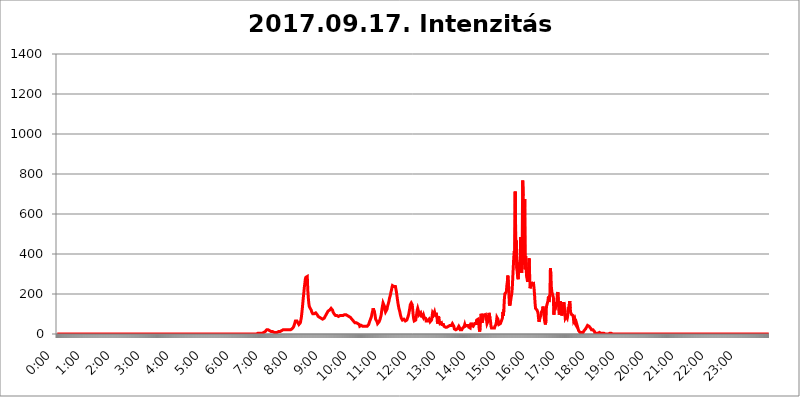
| Category | 2017.09.17. Intenzitás [W/m^2] |
|---|---|
| 0.0 | 0 |
| 0.0006944444444444445 | 0 |
| 0.001388888888888889 | 0 |
| 0.0020833333333333333 | 0 |
| 0.002777777777777778 | 0 |
| 0.003472222222222222 | 0 |
| 0.004166666666666667 | 0 |
| 0.004861111111111111 | 0 |
| 0.005555555555555556 | 0 |
| 0.0062499999999999995 | 0 |
| 0.006944444444444444 | 0 |
| 0.007638888888888889 | 0 |
| 0.008333333333333333 | 0 |
| 0.009027777777777779 | 0 |
| 0.009722222222222222 | 0 |
| 0.010416666666666666 | 0 |
| 0.011111111111111112 | 0 |
| 0.011805555555555555 | 0 |
| 0.012499999999999999 | 0 |
| 0.013194444444444444 | 0 |
| 0.013888888888888888 | 0 |
| 0.014583333333333332 | 0 |
| 0.015277777777777777 | 0 |
| 0.015972222222222224 | 0 |
| 0.016666666666666666 | 0 |
| 0.017361111111111112 | 0 |
| 0.018055555555555557 | 0 |
| 0.01875 | 0 |
| 0.019444444444444445 | 0 |
| 0.02013888888888889 | 0 |
| 0.020833333333333332 | 0 |
| 0.02152777777777778 | 0 |
| 0.022222222222222223 | 0 |
| 0.02291666666666667 | 0 |
| 0.02361111111111111 | 0 |
| 0.024305555555555556 | 0 |
| 0.024999999999999998 | 0 |
| 0.025694444444444447 | 0 |
| 0.02638888888888889 | 0 |
| 0.027083333333333334 | 0 |
| 0.027777777777777776 | 0 |
| 0.02847222222222222 | 0 |
| 0.029166666666666664 | 0 |
| 0.029861111111111113 | 0 |
| 0.030555555555555555 | 0 |
| 0.03125 | 0 |
| 0.03194444444444445 | 0 |
| 0.03263888888888889 | 0 |
| 0.03333333333333333 | 0 |
| 0.034027777777777775 | 0 |
| 0.034722222222222224 | 0 |
| 0.035416666666666666 | 0 |
| 0.036111111111111115 | 0 |
| 0.03680555555555556 | 0 |
| 0.0375 | 0 |
| 0.03819444444444444 | 0 |
| 0.03888888888888889 | 0 |
| 0.03958333333333333 | 0 |
| 0.04027777777777778 | 0 |
| 0.04097222222222222 | 0 |
| 0.041666666666666664 | 0 |
| 0.042361111111111106 | 0 |
| 0.04305555555555556 | 0 |
| 0.043750000000000004 | 0 |
| 0.044444444444444446 | 0 |
| 0.04513888888888889 | 0 |
| 0.04583333333333334 | 0 |
| 0.04652777777777778 | 0 |
| 0.04722222222222222 | 0 |
| 0.04791666666666666 | 0 |
| 0.04861111111111111 | 0 |
| 0.049305555555555554 | 0 |
| 0.049999999999999996 | 0 |
| 0.05069444444444445 | 0 |
| 0.051388888888888894 | 0 |
| 0.052083333333333336 | 0 |
| 0.05277777777777778 | 0 |
| 0.05347222222222222 | 0 |
| 0.05416666666666667 | 0 |
| 0.05486111111111111 | 0 |
| 0.05555555555555555 | 0 |
| 0.05625 | 0 |
| 0.05694444444444444 | 0 |
| 0.057638888888888885 | 0 |
| 0.05833333333333333 | 0 |
| 0.05902777777777778 | 0 |
| 0.059722222222222225 | 0 |
| 0.06041666666666667 | 0 |
| 0.061111111111111116 | 0 |
| 0.06180555555555556 | 0 |
| 0.0625 | 0 |
| 0.06319444444444444 | 0 |
| 0.06388888888888888 | 0 |
| 0.06458333333333334 | 0 |
| 0.06527777777777778 | 0 |
| 0.06597222222222222 | 0 |
| 0.06666666666666667 | 0 |
| 0.06736111111111111 | 0 |
| 0.06805555555555555 | 0 |
| 0.06874999999999999 | 0 |
| 0.06944444444444443 | 0 |
| 0.07013888888888889 | 0 |
| 0.07083333333333333 | 0 |
| 0.07152777777777779 | 0 |
| 0.07222222222222223 | 0 |
| 0.07291666666666667 | 0 |
| 0.07361111111111111 | 0 |
| 0.07430555555555556 | 0 |
| 0.075 | 0 |
| 0.07569444444444444 | 0 |
| 0.0763888888888889 | 0 |
| 0.07708333333333334 | 0 |
| 0.07777777777777778 | 0 |
| 0.07847222222222222 | 0 |
| 0.07916666666666666 | 0 |
| 0.0798611111111111 | 0 |
| 0.08055555555555556 | 0 |
| 0.08125 | 0 |
| 0.08194444444444444 | 0 |
| 0.08263888888888889 | 0 |
| 0.08333333333333333 | 0 |
| 0.08402777777777777 | 0 |
| 0.08472222222222221 | 0 |
| 0.08541666666666665 | 0 |
| 0.08611111111111112 | 0 |
| 0.08680555555555557 | 0 |
| 0.08750000000000001 | 0 |
| 0.08819444444444445 | 0 |
| 0.08888888888888889 | 0 |
| 0.08958333333333333 | 0 |
| 0.09027777777777778 | 0 |
| 0.09097222222222222 | 0 |
| 0.09166666666666667 | 0 |
| 0.09236111111111112 | 0 |
| 0.09305555555555556 | 0 |
| 0.09375 | 0 |
| 0.09444444444444444 | 0 |
| 0.09513888888888888 | 0 |
| 0.09583333333333333 | 0 |
| 0.09652777777777777 | 0 |
| 0.09722222222222222 | 0 |
| 0.09791666666666667 | 0 |
| 0.09861111111111111 | 0 |
| 0.09930555555555555 | 0 |
| 0.09999999999999999 | 0 |
| 0.10069444444444443 | 0 |
| 0.1013888888888889 | 0 |
| 0.10208333333333335 | 0 |
| 0.10277777777777779 | 0 |
| 0.10347222222222223 | 0 |
| 0.10416666666666667 | 0 |
| 0.10486111111111111 | 0 |
| 0.10555555555555556 | 0 |
| 0.10625 | 0 |
| 0.10694444444444444 | 0 |
| 0.1076388888888889 | 0 |
| 0.10833333333333334 | 0 |
| 0.10902777777777778 | 0 |
| 0.10972222222222222 | 0 |
| 0.1111111111111111 | 0 |
| 0.11180555555555556 | 0 |
| 0.11180555555555556 | 0 |
| 0.1125 | 0 |
| 0.11319444444444444 | 0 |
| 0.11388888888888889 | 0 |
| 0.11458333333333333 | 0 |
| 0.11527777777777777 | 0 |
| 0.11597222222222221 | 0 |
| 0.11666666666666665 | 0 |
| 0.1173611111111111 | 0 |
| 0.11805555555555557 | 0 |
| 0.11944444444444445 | 0 |
| 0.12013888888888889 | 0 |
| 0.12083333333333333 | 0 |
| 0.12152777777777778 | 0 |
| 0.12222222222222223 | 0 |
| 0.12291666666666667 | 0 |
| 0.12291666666666667 | 0 |
| 0.12361111111111112 | 0 |
| 0.12430555555555556 | 0 |
| 0.125 | 0 |
| 0.12569444444444444 | 0 |
| 0.12638888888888888 | 0 |
| 0.12708333333333333 | 0 |
| 0.16875 | 0 |
| 0.12847222222222224 | 0 |
| 0.12916666666666668 | 0 |
| 0.12986111111111112 | 0 |
| 0.13055555555555556 | 0 |
| 0.13125 | 0 |
| 0.13194444444444445 | 0 |
| 0.1326388888888889 | 0 |
| 0.13333333333333333 | 0 |
| 0.13402777777777777 | 0 |
| 0.13402777777777777 | 0 |
| 0.13472222222222222 | 0 |
| 0.13541666666666666 | 0 |
| 0.1361111111111111 | 0 |
| 0.13749999999999998 | 0 |
| 0.13819444444444443 | 0 |
| 0.1388888888888889 | 0 |
| 0.13958333333333334 | 0 |
| 0.14027777777777778 | 0 |
| 0.14097222222222222 | 0 |
| 0.14166666666666666 | 0 |
| 0.1423611111111111 | 0 |
| 0.14305555555555557 | 0 |
| 0.14375000000000002 | 0 |
| 0.14444444444444446 | 0 |
| 0.1451388888888889 | 0 |
| 0.1451388888888889 | 0 |
| 0.14652777777777778 | 0 |
| 0.14722222222222223 | 0 |
| 0.14791666666666667 | 0 |
| 0.1486111111111111 | 0 |
| 0.14930555555555555 | 0 |
| 0.15 | 0 |
| 0.15069444444444444 | 0 |
| 0.15138888888888888 | 0 |
| 0.15208333333333332 | 0 |
| 0.15277777777777776 | 0 |
| 0.15347222222222223 | 0 |
| 0.15416666666666667 | 0 |
| 0.15486111111111112 | 0 |
| 0.15555555555555556 | 0 |
| 0.15625 | 0 |
| 0.15694444444444444 | 0 |
| 0.15763888888888888 | 0 |
| 0.15833333333333333 | 0 |
| 0.15902777777777777 | 0 |
| 0.15972222222222224 | 0 |
| 0.16041666666666668 | 0 |
| 0.16111111111111112 | 0 |
| 0.16180555555555556 | 0 |
| 0.1625 | 0 |
| 0.16319444444444445 | 0 |
| 0.1638888888888889 | 0 |
| 0.16458333333333333 | 0 |
| 0.16527777777777777 | 0 |
| 0.16597222222222222 | 0 |
| 0.16666666666666666 | 0 |
| 0.1673611111111111 | 0 |
| 0.16805555555555554 | 0 |
| 0.16874999999999998 | 0 |
| 0.16944444444444443 | 0 |
| 0.17013888888888887 | 0 |
| 0.1708333333333333 | 0 |
| 0.17152777777777775 | 0 |
| 0.17222222222222225 | 0 |
| 0.1729166666666667 | 0 |
| 0.17361111111111113 | 0 |
| 0.17430555555555557 | 0 |
| 0.17500000000000002 | 0 |
| 0.17569444444444446 | 0 |
| 0.1763888888888889 | 0 |
| 0.17708333333333334 | 0 |
| 0.17777777777777778 | 0 |
| 0.17847222222222223 | 0 |
| 0.17916666666666667 | 0 |
| 0.1798611111111111 | 0 |
| 0.18055555555555555 | 0 |
| 0.18125 | 0 |
| 0.18194444444444444 | 0 |
| 0.1826388888888889 | 0 |
| 0.18333333333333335 | 0 |
| 0.1840277777777778 | 0 |
| 0.18472222222222223 | 0 |
| 0.18541666666666667 | 0 |
| 0.18611111111111112 | 0 |
| 0.18680555555555556 | 0 |
| 0.1875 | 0 |
| 0.18819444444444444 | 0 |
| 0.18888888888888888 | 0 |
| 0.18958333333333333 | 0 |
| 0.19027777777777777 | 0 |
| 0.1909722222222222 | 0 |
| 0.19166666666666665 | 0 |
| 0.19236111111111112 | 0 |
| 0.19305555555555554 | 0 |
| 0.19375 | 0 |
| 0.19444444444444445 | 0 |
| 0.1951388888888889 | 0 |
| 0.19583333333333333 | 0 |
| 0.19652777777777777 | 0 |
| 0.19722222222222222 | 0 |
| 0.19791666666666666 | 0 |
| 0.1986111111111111 | 0 |
| 0.19930555555555554 | 0 |
| 0.19999999999999998 | 0 |
| 0.20069444444444443 | 0 |
| 0.20138888888888887 | 0 |
| 0.2020833333333333 | 0 |
| 0.2027777777777778 | 0 |
| 0.2034722222222222 | 0 |
| 0.2041666666666667 | 0 |
| 0.20486111111111113 | 0 |
| 0.20555555555555557 | 0 |
| 0.20625000000000002 | 0 |
| 0.20694444444444446 | 0 |
| 0.2076388888888889 | 0 |
| 0.20833333333333334 | 0 |
| 0.20902777777777778 | 0 |
| 0.20972222222222223 | 0 |
| 0.21041666666666667 | 0 |
| 0.2111111111111111 | 0 |
| 0.21180555555555555 | 0 |
| 0.2125 | 0 |
| 0.21319444444444444 | 0 |
| 0.2138888888888889 | 0 |
| 0.21458333333333335 | 0 |
| 0.2152777777777778 | 0 |
| 0.21597222222222223 | 0 |
| 0.21666666666666667 | 0 |
| 0.21736111111111112 | 0 |
| 0.21805555555555556 | 0 |
| 0.21875 | 0 |
| 0.21944444444444444 | 0 |
| 0.22013888888888888 | 0 |
| 0.22083333333333333 | 0 |
| 0.22152777777777777 | 0 |
| 0.2222222222222222 | 0 |
| 0.22291666666666665 | 0 |
| 0.2236111111111111 | 0 |
| 0.22430555555555556 | 0 |
| 0.225 | 0 |
| 0.22569444444444445 | 0 |
| 0.2263888888888889 | 0 |
| 0.22708333333333333 | 0 |
| 0.22777777777777777 | 0 |
| 0.22847222222222222 | 0 |
| 0.22916666666666666 | 0 |
| 0.2298611111111111 | 0 |
| 0.23055555555555554 | 0 |
| 0.23124999999999998 | 0 |
| 0.23194444444444443 | 0 |
| 0.23263888888888887 | 0 |
| 0.2333333333333333 | 0 |
| 0.2340277777777778 | 0 |
| 0.2347222222222222 | 0 |
| 0.2354166666666667 | 0 |
| 0.23611111111111113 | 0 |
| 0.23680555555555557 | 0 |
| 0.23750000000000002 | 0 |
| 0.23819444444444446 | 0 |
| 0.2388888888888889 | 0 |
| 0.23958333333333334 | 0 |
| 0.24027777777777778 | 0 |
| 0.24097222222222223 | 0 |
| 0.24166666666666667 | 0 |
| 0.2423611111111111 | 0 |
| 0.24305555555555555 | 0 |
| 0.24375 | 0 |
| 0.24444444444444446 | 0 |
| 0.24513888888888888 | 0 |
| 0.24583333333333335 | 0 |
| 0.2465277777777778 | 0 |
| 0.24722222222222223 | 0 |
| 0.24791666666666667 | 0 |
| 0.24861111111111112 | 0 |
| 0.24930555555555556 | 0 |
| 0.25 | 0 |
| 0.25069444444444444 | 0 |
| 0.2513888888888889 | 0 |
| 0.2520833333333333 | 0 |
| 0.25277777777777777 | 0 |
| 0.2534722222222222 | 0 |
| 0.25416666666666665 | 0 |
| 0.2548611111111111 | 0 |
| 0.2555555555555556 | 0 |
| 0.25625000000000003 | 0 |
| 0.2569444444444445 | 0 |
| 0.2576388888888889 | 0 |
| 0.25833333333333336 | 0 |
| 0.2590277777777778 | 0 |
| 0.25972222222222224 | 0 |
| 0.2604166666666667 | 0 |
| 0.2611111111111111 | 0 |
| 0.26180555555555557 | 0 |
| 0.2625 | 0 |
| 0.26319444444444445 | 0 |
| 0.2638888888888889 | 0 |
| 0.26458333333333334 | 0 |
| 0.2652777777777778 | 0 |
| 0.2659722222222222 | 0 |
| 0.26666666666666666 | 0 |
| 0.2673611111111111 | 0 |
| 0.26805555555555555 | 0 |
| 0.26875 | 0 |
| 0.26944444444444443 | 0 |
| 0.2701388888888889 | 0 |
| 0.2708333333333333 | 0 |
| 0.27152777777777776 | 0 |
| 0.2722222222222222 | 0 |
| 0.27291666666666664 | 0 |
| 0.2736111111111111 | 0 |
| 0.2743055555555555 | 0 |
| 0.27499999999999997 | 0 |
| 0.27569444444444446 | 0 |
| 0.27638888888888885 | 0 |
| 0.27708333333333335 | 0 |
| 0.2777777777777778 | 0 |
| 0.27847222222222223 | 0 |
| 0.2791666666666667 | 0 |
| 0.2798611111111111 | 0 |
| 0.28055555555555556 | 3.525 |
| 0.28125 | 3.525 |
| 0.28194444444444444 | 3.525 |
| 0.2826388888888889 | 3.525 |
| 0.2833333333333333 | 3.525 |
| 0.28402777777777777 | 3.525 |
| 0.2847222222222222 | 3.525 |
| 0.28541666666666665 | 3.525 |
| 0.28611111111111115 | 3.525 |
| 0.28680555555555554 | 3.525 |
| 0.28750000000000003 | 3.525 |
| 0.2881944444444445 | 3.525 |
| 0.2888888888888889 | 7.887 |
| 0.28958333333333336 | 7.887 |
| 0.2902777777777778 | 7.887 |
| 0.29097222222222224 | 7.887 |
| 0.2916666666666667 | 12.257 |
| 0.2923611111111111 | 16.636 |
| 0.29305555555555557 | 16.636 |
| 0.29375 | 21.024 |
| 0.29444444444444445 | 21.024 |
| 0.2951388888888889 | 21.024 |
| 0.29583333333333334 | 21.024 |
| 0.2965277777777778 | 16.636 |
| 0.2972222222222222 | 16.636 |
| 0.29791666666666666 | 16.636 |
| 0.2986111111111111 | 16.636 |
| 0.29930555555555555 | 16.636 |
| 0.3 | 12.257 |
| 0.30069444444444443 | 12.257 |
| 0.3013888888888889 | 12.257 |
| 0.3020833333333333 | 12.257 |
| 0.30277777777777776 | 12.257 |
| 0.3034722222222222 | 12.257 |
| 0.30416666666666664 | 7.887 |
| 0.3048611111111111 | 7.887 |
| 0.3055555555555555 | 7.887 |
| 0.30624999999999997 | 7.887 |
| 0.3069444444444444 | 7.887 |
| 0.3076388888888889 | 7.887 |
| 0.30833333333333335 | 7.887 |
| 0.3090277777777778 | 12.257 |
| 0.30972222222222223 | 12.257 |
| 0.3104166666666667 | 12.257 |
| 0.3111111111111111 | 12.257 |
| 0.31180555555555556 | 12.257 |
| 0.3125 | 12.257 |
| 0.31319444444444444 | 12.257 |
| 0.3138888888888889 | 12.257 |
| 0.3145833333333333 | 16.636 |
| 0.31527777777777777 | 16.636 |
| 0.3159722222222222 | 16.636 |
| 0.31666666666666665 | 21.024 |
| 0.31736111111111115 | 21.024 |
| 0.31805555555555554 | 21.024 |
| 0.31875000000000003 | 21.024 |
| 0.3194444444444445 | 21.024 |
| 0.3201388888888889 | 21.024 |
| 0.32083333333333336 | 21.024 |
| 0.3215277777777778 | 16.636 |
| 0.32222222222222224 | 16.636 |
| 0.3229166666666667 | 21.024 |
| 0.3236111111111111 | 21.024 |
| 0.32430555555555557 | 21.024 |
| 0.325 | 21.024 |
| 0.32569444444444445 | 21.024 |
| 0.3263888888888889 | 21.024 |
| 0.32708333333333334 | 21.024 |
| 0.3277777777777778 | 25.419 |
| 0.3284722222222222 | 25.419 |
| 0.32916666666666666 | 25.419 |
| 0.3298611111111111 | 25.419 |
| 0.33055555555555555 | 29.823 |
| 0.33125 | 34.234 |
| 0.33194444444444443 | 38.653 |
| 0.3326388888888889 | 47.511 |
| 0.3333333333333333 | 56.398 |
| 0.3340277777777778 | 65.31 |
| 0.3347222222222222 | 69.775 |
| 0.3354166666666667 | 69.775 |
| 0.3361111111111111 | 65.31 |
| 0.3368055555555556 | 60.85 |
| 0.33749999999999997 | 56.398 |
| 0.33819444444444446 | 51.951 |
| 0.33888888888888885 | 47.511 |
| 0.33958333333333335 | 47.511 |
| 0.34027777777777773 | 51.951 |
| 0.34097222222222223 | 56.398 |
| 0.3416666666666666 | 69.775 |
| 0.3423611111111111 | 83.205 |
| 0.3430555555555555 | 105.69 |
| 0.34375 | 128.284 |
| 0.3444444444444445 | 155.509 |
| 0.3451388888888889 | 182.82 |
| 0.3458333333333334 | 205.62 |
| 0.34652777777777777 | 233 |
| 0.34722222222222227 | 251.251 |
| 0.34791666666666665 | 274.047 |
| 0.34861111111111115 | 283.156 |
| 0.34930555555555554 | 287.709 |
| 0.35000000000000003 | 278.603 |
| 0.3506944444444444 | 287.709 |
| 0.3513888888888889 | 219.309 |
| 0.3520833333333333 | 182.82 |
| 0.3527777777777778 | 155.509 |
| 0.3534722222222222 | 137.347 |
| 0.3541666666666667 | 132.814 |
| 0.3548611111111111 | 128.284 |
| 0.35555555555555557 | 123.758 |
| 0.35625 | 119.235 |
| 0.35694444444444445 | 110.201 |
| 0.3576388888888889 | 105.69 |
| 0.35833333333333334 | 101.184 |
| 0.3590277777777778 | 101.184 |
| 0.3597222222222222 | 101.184 |
| 0.36041666666666666 | 101.184 |
| 0.3611111111111111 | 105.69 |
| 0.36180555555555555 | 105.69 |
| 0.3625 | 105.69 |
| 0.36319444444444443 | 105.69 |
| 0.3638888888888889 | 101.184 |
| 0.3645833333333333 | 96.682 |
| 0.3652777777777778 | 92.184 |
| 0.3659722222222222 | 87.692 |
| 0.3666666666666667 | 83.205 |
| 0.3673611111111111 | 83.205 |
| 0.3680555555555556 | 83.205 |
| 0.36874999999999997 | 83.205 |
| 0.36944444444444446 | 78.722 |
| 0.37013888888888885 | 78.722 |
| 0.37083333333333335 | 74.246 |
| 0.37152777777777773 | 74.246 |
| 0.37222222222222223 | 74.246 |
| 0.3729166666666666 | 74.246 |
| 0.3736111111111111 | 74.246 |
| 0.3743055555555555 | 78.722 |
| 0.375 | 83.205 |
| 0.3756944444444445 | 87.692 |
| 0.3763888888888889 | 92.184 |
| 0.3770833333333334 | 96.682 |
| 0.37777777777777777 | 101.184 |
| 0.37847222222222227 | 105.69 |
| 0.37916666666666665 | 110.201 |
| 0.37986111111111115 | 114.716 |
| 0.38055555555555554 | 114.716 |
| 0.38125000000000003 | 119.235 |
| 0.3819444444444444 | 119.235 |
| 0.3826388888888889 | 123.758 |
| 0.3833333333333333 | 123.758 |
| 0.3840277777777778 | 128.284 |
| 0.3847222222222222 | 128.284 |
| 0.3854166666666667 | 123.758 |
| 0.3861111111111111 | 119.235 |
| 0.38680555555555557 | 110.201 |
| 0.3875 | 105.69 |
| 0.38819444444444445 | 101.184 |
| 0.3888888888888889 | 101.184 |
| 0.38958333333333334 | 96.682 |
| 0.3902777777777778 | 92.184 |
| 0.3909722222222222 | 92.184 |
| 0.39166666666666666 | 92.184 |
| 0.3923611111111111 | 92.184 |
| 0.39305555555555555 | 87.692 |
| 0.39375 | 87.692 |
| 0.39444444444444443 | 87.692 |
| 0.3951388888888889 | 87.692 |
| 0.3958333333333333 | 92.184 |
| 0.3965277777777778 | 92.184 |
| 0.3972222222222222 | 92.184 |
| 0.3979166666666667 | 92.184 |
| 0.3986111111111111 | 92.184 |
| 0.3993055555555556 | 92.184 |
| 0.39999999999999997 | 92.184 |
| 0.40069444444444446 | 92.184 |
| 0.40138888888888885 | 92.184 |
| 0.40208333333333335 | 92.184 |
| 0.40277777777777773 | 96.682 |
| 0.40347222222222223 | 96.682 |
| 0.4041666666666666 | 96.682 |
| 0.4048611111111111 | 96.682 |
| 0.4055555555555555 | 92.184 |
| 0.40625 | 92.184 |
| 0.4069444444444445 | 92.184 |
| 0.4076388888888889 | 87.692 |
| 0.4083333333333334 | 87.692 |
| 0.40902777777777777 | 87.692 |
| 0.40972222222222227 | 83.205 |
| 0.41041666666666665 | 83.205 |
| 0.41111111111111115 | 83.205 |
| 0.41180555555555554 | 78.722 |
| 0.41250000000000003 | 78.722 |
| 0.4131944444444444 | 74.246 |
| 0.4138888888888889 | 74.246 |
| 0.4145833333333333 | 69.775 |
| 0.4152777777777778 | 65.31 |
| 0.4159722222222222 | 60.85 |
| 0.4166666666666667 | 60.85 |
| 0.4173611111111111 | 56.398 |
| 0.41805555555555557 | 56.398 |
| 0.41875 | 56.398 |
| 0.41944444444444445 | 56.398 |
| 0.4201388888888889 | 56.398 |
| 0.42083333333333334 | 56.398 |
| 0.4215277777777778 | 51.951 |
| 0.4222222222222222 | 51.951 |
| 0.42291666666666666 | 47.511 |
| 0.4236111111111111 | 47.511 |
| 0.42430555555555555 | 38.653 |
| 0.425 | 38.653 |
| 0.42569444444444443 | 38.653 |
| 0.4263888888888889 | 43.079 |
| 0.4270833333333333 | 43.079 |
| 0.4277777777777778 | 43.079 |
| 0.4284722222222222 | 38.653 |
| 0.4291666666666667 | 38.653 |
| 0.4298611111111111 | 38.653 |
| 0.4305555555555556 | 38.653 |
| 0.43124999999999997 | 38.653 |
| 0.43194444444444446 | 38.653 |
| 0.43263888888888885 | 38.653 |
| 0.43333333333333335 | 38.653 |
| 0.43402777777777773 | 38.653 |
| 0.43472222222222223 | 38.653 |
| 0.4354166666666666 | 38.653 |
| 0.4361111111111111 | 43.079 |
| 0.4368055555555555 | 47.511 |
| 0.4375 | 56.398 |
| 0.4381944444444445 | 60.85 |
| 0.4388888888888889 | 69.775 |
| 0.4395833333333334 | 74.246 |
| 0.44027777777777777 | 83.205 |
| 0.44097222222222227 | 92.184 |
| 0.44166666666666665 | 105.69 |
| 0.44236111111111115 | 114.716 |
| 0.44305555555555554 | 128.284 |
| 0.44375000000000003 | 128.284 |
| 0.4444444444444444 | 123.758 |
| 0.4451388888888889 | 105.69 |
| 0.4458333333333333 | 92.184 |
| 0.4465277777777778 | 74.246 |
| 0.4472222222222222 | 69.775 |
| 0.4479166666666667 | 69.775 |
| 0.4486111111111111 | 60.85 |
| 0.44930555555555557 | 51.951 |
| 0.45 | 51.951 |
| 0.45069444444444445 | 56.398 |
| 0.4513888888888889 | 60.85 |
| 0.45208333333333334 | 65.31 |
| 0.4527777777777778 | 74.246 |
| 0.4534722222222222 | 78.722 |
| 0.45416666666666666 | 92.184 |
| 0.4548611111111111 | 110.201 |
| 0.45555555555555555 | 128.284 |
| 0.45625 | 141.884 |
| 0.45694444444444443 | 155.509 |
| 0.4576388888888889 | 160.056 |
| 0.4583333333333333 | 155.509 |
| 0.4590277777777778 | 137.347 |
| 0.4597222222222222 | 119.235 |
| 0.4604166666666667 | 110.201 |
| 0.4611111111111111 | 110.201 |
| 0.4618055555555556 | 110.201 |
| 0.46249999999999997 | 123.758 |
| 0.46319444444444446 | 137.347 |
| 0.46388888888888885 | 146.423 |
| 0.46458333333333335 | 155.509 |
| 0.46527777777777773 | 164.605 |
| 0.46597222222222223 | 178.264 |
| 0.4666666666666666 | 187.378 |
| 0.4673611111111111 | 196.497 |
| 0.4680555555555555 | 210.182 |
| 0.46875 | 219.309 |
| 0.4694444444444445 | 233 |
| 0.4701388888888889 | 242.127 |
| 0.4708333333333334 | 246.689 |
| 0.47152777777777777 | 237.564 |
| 0.47222222222222227 | 237.564 |
| 0.47291666666666665 | 237.564 |
| 0.47361111111111115 | 242.127 |
| 0.47430555555555554 | 237.564 |
| 0.47500000000000003 | 233 |
| 0.4756944444444444 | 210.182 |
| 0.4763888888888889 | 191.937 |
| 0.4770833333333333 | 173.709 |
| 0.4777777777777778 | 155.509 |
| 0.4784722222222222 | 141.884 |
| 0.4791666666666667 | 128.284 |
| 0.4798611111111111 | 119.235 |
| 0.48055555555555557 | 110.201 |
| 0.48125 | 96.682 |
| 0.48194444444444445 | 87.692 |
| 0.4826388888888889 | 78.722 |
| 0.48333333333333334 | 74.246 |
| 0.4840277777777778 | 69.775 |
| 0.4847222222222222 | 74.246 |
| 0.48541666666666666 | 74.246 |
| 0.4861111111111111 | 74.246 |
| 0.48680555555555555 | 78.722 |
| 0.4875 | 74.246 |
| 0.48819444444444443 | 65.31 |
| 0.4888888888888889 | 65.31 |
| 0.4895833333333333 | 65.31 |
| 0.4902777777777778 | 69.775 |
| 0.4909722222222222 | 74.246 |
| 0.4916666666666667 | 83.205 |
| 0.4923611111111111 | 92.184 |
| 0.4930555555555556 | 101.184 |
| 0.49374999999999997 | 114.716 |
| 0.49444444444444446 | 128.284 |
| 0.49513888888888885 | 146.423 |
| 0.49583333333333335 | 150.964 |
| 0.49652777777777773 | 155.509 |
| 0.49722222222222223 | 160.056 |
| 0.4979166666666666 | 146.423 |
| 0.4986111111111111 | 119.235 |
| 0.4993055555555555 | 92.184 |
| 0.5 | 74.246 |
| 0.5006944444444444 | 65.31 |
| 0.5013888888888889 | 65.31 |
| 0.5020833333333333 | 65.31 |
| 0.5027777777777778 | 69.775 |
| 0.5034722222222222 | 83.205 |
| 0.5041666666666667 | 101.184 |
| 0.5048611111111111 | 119.235 |
| 0.5055555555555555 | 128.284 |
| 0.50625 | 123.758 |
| 0.5069444444444444 | 110.201 |
| 0.5076388888888889 | 96.682 |
| 0.5083333333333333 | 92.184 |
| 0.5090277777777777 | 101.184 |
| 0.5097222222222222 | 105.69 |
| 0.5104166666666666 | 101.184 |
| 0.5111111111111112 | 83.205 |
| 0.5118055555555555 | 92.184 |
| 0.5125000000000001 | 87.692 |
| 0.5131944444444444 | 83.205 |
| 0.513888888888889 | 92.184 |
| 0.5145833333333333 | 83.205 |
| 0.5152777777777778 | 78.722 |
| 0.5159722222222222 | 78.722 |
| 0.5166666666666667 | 78.722 |
| 0.517361111111111 | 65.31 |
| 0.5180555555555556 | 60.85 |
| 0.5187499999999999 | 65.31 |
| 0.5194444444444445 | 65.31 |
| 0.5201388888888888 | 65.31 |
| 0.5208333333333334 | 65.31 |
| 0.5215277777777778 | 74.246 |
| 0.5222222222222223 | 69.775 |
| 0.5229166666666667 | 60.85 |
| 0.5236111111111111 | 65.31 |
| 0.5243055555555556 | 60.85 |
| 0.525 | 69.775 |
| 0.5256944444444445 | 87.692 |
| 0.5263888888888889 | 105.69 |
| 0.5270833333333333 | 101.184 |
| 0.5277777777777778 | 96.682 |
| 0.5284722222222222 | 101.184 |
| 0.5291666666666667 | 110.201 |
| 0.5298611111111111 | 105.69 |
| 0.5305555555555556 | 87.692 |
| 0.53125 | 105.69 |
| 0.5319444444444444 | 101.184 |
| 0.5326388888888889 | 83.205 |
| 0.5333333333333333 | 51.951 |
| 0.5340277777777778 | 60.85 |
| 0.5347222222222222 | 87.692 |
| 0.5354166666666667 | 78.722 |
| 0.5361111111111111 | 60.85 |
| 0.5368055555555555 | 51.951 |
| 0.5375 | 56.398 |
| 0.5381944444444444 | 56.398 |
| 0.5388888888888889 | 56.398 |
| 0.5395833333333333 | 47.511 |
| 0.5402777777777777 | 47.511 |
| 0.5409722222222222 | 47.511 |
| 0.5416666666666666 | 47.511 |
| 0.5423611111111112 | 38.653 |
| 0.5430555555555555 | 38.653 |
| 0.5437500000000001 | 38.653 |
| 0.5444444444444444 | 34.234 |
| 0.545138888888889 | 34.234 |
| 0.5458333333333333 | 34.234 |
| 0.5465277777777778 | 34.234 |
| 0.5472222222222222 | 34.234 |
| 0.5479166666666667 | 34.234 |
| 0.548611111111111 | 38.653 |
| 0.5493055555555556 | 38.653 |
| 0.5499999999999999 | 38.653 |
| 0.5506944444444445 | 43.079 |
| 0.5513888888888888 | 47.511 |
| 0.5520833333333334 | 43.079 |
| 0.5527777777777778 | 43.079 |
| 0.5534722222222223 | 47.511 |
| 0.5541666666666667 | 51.951 |
| 0.5548611111111111 | 47.511 |
| 0.5555555555555556 | 47.511 |
| 0.55625 | 38.653 |
| 0.5569444444444445 | 25.419 |
| 0.5576388888888889 | 25.419 |
| 0.5583333333333333 | 25.419 |
| 0.5590277777777778 | 21.024 |
| 0.5597222222222222 | 21.024 |
| 0.5604166666666667 | 21.024 |
| 0.5611111111111111 | 25.419 |
| 0.5618055555555556 | 29.823 |
| 0.5625 | 29.823 |
| 0.5631944444444444 | 38.653 |
| 0.5638888888888889 | 34.234 |
| 0.5645833333333333 | 29.823 |
| 0.5652777777777778 | 21.024 |
| 0.5659722222222222 | 21.024 |
| 0.5666666666666667 | 21.024 |
| 0.5673611111111111 | 21.024 |
| 0.5680555555555555 | 21.024 |
| 0.56875 | 29.823 |
| 0.5694444444444444 | 29.823 |
| 0.5701388888888889 | 29.823 |
| 0.5708333333333333 | 38.653 |
| 0.5715277777777777 | 47.511 |
| 0.5722222222222222 | 38.653 |
| 0.5729166666666666 | 38.653 |
| 0.5736111111111112 | 38.653 |
| 0.5743055555555555 | 43.079 |
| 0.5750000000000001 | 47.511 |
| 0.5756944444444444 | 47.511 |
| 0.576388888888889 | 43.079 |
| 0.5770833333333333 | 34.234 |
| 0.5777777777777778 | 29.823 |
| 0.5784722222222222 | 29.823 |
| 0.5791666666666667 | 29.823 |
| 0.579861111111111 | 47.511 |
| 0.5805555555555556 | 56.398 |
| 0.5812499999999999 | 43.079 |
| 0.5819444444444445 | 38.653 |
| 0.5826388888888888 | 38.653 |
| 0.5833333333333334 | 38.653 |
| 0.5840277777777778 | 38.653 |
| 0.5847222222222223 | 43.079 |
| 0.5854166666666667 | 51.951 |
| 0.5861111111111111 | 56.398 |
| 0.5868055555555556 | 51.951 |
| 0.5875 | 51.951 |
| 0.5881944444444445 | 69.775 |
| 0.5888888888888889 | 69.775 |
| 0.5895833333333333 | 74.246 |
| 0.5902777777777778 | 74.246 |
| 0.5909722222222222 | 60.85 |
| 0.5916666666666667 | 29.823 |
| 0.5923611111111111 | 12.257 |
| 0.5930555555555556 | 29.823 |
| 0.59375 | 69.775 |
| 0.5944444444444444 | 101.184 |
| 0.5951388888888889 | 87.692 |
| 0.5958333333333333 | 56.398 |
| 0.5965277777777778 | 60.85 |
| 0.5972222222222222 | 78.722 |
| 0.5979166666666667 | 101.184 |
| 0.5986111111111111 | 92.184 |
| 0.5993055555555555 | 96.682 |
| 0.6 | 92.184 |
| 0.6006944444444444 | 96.682 |
| 0.6013888888888889 | 96.682 |
| 0.6020833333333333 | 69.775 |
| 0.6027777777777777 | 51.951 |
| 0.6034722222222222 | 47.511 |
| 0.6041666666666666 | 51.951 |
| 0.6048611111111112 | 69.775 |
| 0.6055555555555555 | 105.69 |
| 0.6062500000000001 | 105.69 |
| 0.6069444444444444 | 78.722 |
| 0.607638888888889 | 65.31 |
| 0.6083333333333333 | 38.653 |
| 0.6090277777777778 | 29.823 |
| 0.6097222222222222 | 34.234 |
| 0.6104166666666667 | 34.234 |
| 0.611111111111111 | 29.823 |
| 0.6118055555555556 | 25.419 |
| 0.6124999999999999 | 25.419 |
| 0.6131944444444445 | 29.823 |
| 0.6138888888888888 | 38.653 |
| 0.6145833333333334 | 43.079 |
| 0.6152777777777778 | 47.511 |
| 0.6159722222222223 | 60.85 |
| 0.6166666666666667 | 83.205 |
| 0.6173611111111111 | 78.722 |
| 0.6180555555555556 | 74.246 |
| 0.61875 | 69.775 |
| 0.6194444444444445 | 47.511 |
| 0.6201388888888889 | 43.079 |
| 0.6208333333333333 | 47.511 |
| 0.6215277777777778 | 51.951 |
| 0.6222222222222222 | 56.398 |
| 0.6229166666666667 | 65.31 |
| 0.6236111111111111 | 65.31 |
| 0.6243055555555556 | 78.722 |
| 0.625 | 110.201 |
| 0.6256944444444444 | 92.184 |
| 0.6263888888888889 | 123.758 |
| 0.6270833333333333 | 173.709 |
| 0.6277777777777778 | 201.058 |
| 0.6284722222222222 | 205.62 |
| 0.6291666666666667 | 196.497 |
| 0.6298611111111111 | 210.182 |
| 0.6305555555555555 | 242.127 |
| 0.63125 | 260.373 |
| 0.6319444444444444 | 292.259 |
| 0.6326388888888889 | 287.709 |
| 0.6333333333333333 | 223.873 |
| 0.6340277777777777 | 150.964 |
| 0.6347222222222222 | 141.884 |
| 0.6354166666666666 | 141.884 |
| 0.6361111111111112 | 173.709 |
| 0.6368055555555555 | 187.378 |
| 0.6375000000000001 | 201.058 |
| 0.6381944444444444 | 228.436 |
| 0.638888888888889 | 283.156 |
| 0.6395833333333333 | 283.156 |
| 0.6402777777777778 | 382.715 |
| 0.6409722222222222 | 414.035 |
| 0.6416666666666667 | 396.164 |
| 0.642361111111111 | 711.832 |
| 0.6430555555555556 | 431.833 |
| 0.6437499999999999 | 467.187 |
| 0.6444444444444445 | 328.584 |
| 0.6451388888888888 | 310.44 |
| 0.6458333333333334 | 283.156 |
| 0.6465277777777778 | 274.047 |
| 0.6472222222222223 | 342.162 |
| 0.6479166666666667 | 333.113 |
| 0.6486111111111111 | 360.221 |
| 0.6493055555555556 | 391.685 |
| 0.65 | 484.735 |
| 0.6506944444444445 | 337.639 |
| 0.6513888888888889 | 305.898 |
| 0.6520833333333333 | 436.27 |
| 0.6527777777777778 | 767.62 |
| 0.6534722222222222 | 691.608 |
| 0.6541666666666667 | 695.666 |
| 0.6548611111111111 | 346.682 |
| 0.6555555555555556 | 675.311 |
| 0.65625 | 324.052 |
| 0.6569444444444444 | 387.202 |
| 0.6576388888888889 | 324.052 |
| 0.6583333333333333 | 287.709 |
| 0.6590277777777778 | 283.156 |
| 0.6597222222222222 | 260.373 |
| 0.6604166666666667 | 292.259 |
| 0.6611111111111111 | 287.709 |
| 0.6618055555555555 | 378.224 |
| 0.6625 | 301.354 |
| 0.6631944444444444 | 228.436 |
| 0.6638888888888889 | 237.564 |
| 0.6645833333333333 | 260.373 |
| 0.6652777777777777 | 264.932 |
| 0.6659722222222222 | 246.689 |
| 0.6666666666666666 | 242.127 |
| 0.6673611111111111 | 242.127 |
| 0.6680555555555556 | 251.251 |
| 0.6687500000000001 | 228.436 |
| 0.6694444444444444 | 196.497 |
| 0.6701388888888888 | 155.509 |
| 0.6708333333333334 | 128.284 |
| 0.6715277777777778 | 128.284 |
| 0.6722222222222222 | 123.758 |
| 0.6729166666666666 | 119.235 |
| 0.6736111111111112 | 123.758 |
| 0.6743055555555556 | 105.69 |
| 0.6749999999999999 | 78.722 |
| 0.6756944444444444 | 60.85 |
| 0.6763888888888889 | 60.85 |
| 0.6770833333333334 | 83.205 |
| 0.6777777777777777 | 87.692 |
| 0.6784722222222223 | 92.184 |
| 0.6791666666666667 | 110.201 |
| 0.6798611111111111 | 105.69 |
| 0.6805555555555555 | 119.235 |
| 0.68125 | 137.347 |
| 0.6819444444444445 | 119.235 |
| 0.6826388888888889 | 105.69 |
| 0.6833333333333332 | 69.775 |
| 0.6840277777777778 | 56.398 |
| 0.6847222222222222 | 47.511 |
| 0.6854166666666667 | 69.775 |
| 0.686111111111111 | 137.347 |
| 0.6868055555555556 | 137.347 |
| 0.6875 | 132.814 |
| 0.6881944444444444 | 164.605 |
| 0.688888888888889 | 187.378 |
| 0.6895833333333333 | 160.056 |
| 0.6902777777777778 | 164.605 |
| 0.6909722222222222 | 196.497 |
| 0.6916666666666668 | 328.584 |
| 0.6923611111111111 | 292.259 |
| 0.6930555555555555 | 233 |
| 0.69375 | 210.182 |
| 0.6944444444444445 | 201.058 |
| 0.6951388888888889 | 191.937 |
| 0.6958333333333333 | 182.82 |
| 0.6965277777777777 | 96.682 |
| 0.6972222222222223 | 132.814 |
| 0.6979166666666666 | 146.423 |
| 0.6986111111111111 | 146.423 |
| 0.6993055555555556 | 137.347 |
| 0.7000000000000001 | 137.347 |
| 0.7006944444444444 | 160.056 |
| 0.7013888888888888 | 196.497 |
| 0.7020833333333334 | 210.182 |
| 0.7027777777777778 | 164.605 |
| 0.7034722222222222 | 119.235 |
| 0.7041666666666666 | 96.682 |
| 0.7048611111111112 | 128.284 |
| 0.7055555555555556 | 164.605 |
| 0.7062499999999999 | 137.347 |
| 0.7069444444444444 | 105.69 |
| 0.7076388888888889 | 92.184 |
| 0.7083333333333334 | 92.184 |
| 0.7090277777777777 | 96.682 |
| 0.7097222222222223 | 119.235 |
| 0.7104166666666667 | 160.056 |
| 0.7111111111111111 | 164.605 |
| 0.7118055555555555 | 110.201 |
| 0.7125 | 78.722 |
| 0.7131944444444445 | 83.205 |
| 0.7138888888888889 | 87.692 |
| 0.7145833333333332 | 83.205 |
| 0.7152777777777778 | 78.722 |
| 0.7159722222222222 | 92.184 |
| 0.7166666666666667 | 132.814 |
| 0.717361111111111 | 119.235 |
| 0.7180555555555556 | 119.235 |
| 0.71875 | 164.605 |
| 0.7194444444444444 | 128.284 |
| 0.720138888888889 | 105.69 |
| 0.7208333333333333 | 101.184 |
| 0.7215277777777778 | 96.682 |
| 0.7222222222222222 | 96.682 |
| 0.7229166666666668 | 96.682 |
| 0.7236111111111111 | 92.184 |
| 0.7243055555555555 | 65.31 |
| 0.725 | 65.31 |
| 0.7256944444444445 | 74.246 |
| 0.7263888888888889 | 51.951 |
| 0.7270833333333333 | 47.511 |
| 0.7277777777777777 | 43.079 |
| 0.7284722222222223 | 51.951 |
| 0.7291666666666666 | 43.079 |
| 0.7298611111111111 | 34.234 |
| 0.7305555555555556 | 25.419 |
| 0.7312500000000001 | 16.636 |
| 0.7319444444444444 | 12.257 |
| 0.7326388888888888 | 12.257 |
| 0.7333333333333334 | 7.887 |
| 0.7340277777777778 | 7.887 |
| 0.7347222222222222 | 7.887 |
| 0.7354166666666666 | 7.887 |
| 0.7361111111111112 | 7.887 |
| 0.7368055555555556 | 7.887 |
| 0.7374999999999999 | 7.887 |
| 0.7381944444444444 | 12.257 |
| 0.7388888888888889 | 16.636 |
| 0.7395833333333334 | 21.024 |
| 0.7402777777777777 | 21.024 |
| 0.7409722222222223 | 25.419 |
| 0.7416666666666667 | 29.823 |
| 0.7423611111111111 | 34.234 |
| 0.7430555555555555 | 38.653 |
| 0.74375 | 43.079 |
| 0.7444444444444445 | 38.653 |
| 0.7451388888888889 | 38.653 |
| 0.7458333333333332 | 38.653 |
| 0.7465277777777778 | 38.653 |
| 0.7472222222222222 | 34.234 |
| 0.7479166666666667 | 29.823 |
| 0.748611111111111 | 25.419 |
| 0.7493055555555556 | 21.024 |
| 0.75 | 16.636 |
| 0.7506944444444444 | 16.636 |
| 0.751388888888889 | 21.024 |
| 0.7520833333333333 | 21.024 |
| 0.7527777777777778 | 16.636 |
| 0.7534722222222222 | 12.257 |
| 0.7541666666666668 | 3.525 |
| 0.7548611111111111 | 7.887 |
| 0.7555555555555555 | 7.887 |
| 0.75625 | 3.525 |
| 0.7569444444444445 | 3.525 |
| 0.7576388888888889 | 3.525 |
| 0.7583333333333333 | 3.525 |
| 0.7590277777777777 | 7.887 |
| 0.7597222222222223 | 7.887 |
| 0.7604166666666666 | 7.887 |
| 0.7611111111111111 | 7.887 |
| 0.7618055555555556 | 7.887 |
| 0.7625000000000001 | 3.525 |
| 0.7631944444444444 | 3.525 |
| 0.7638888888888888 | 3.525 |
| 0.7645833333333334 | 3.525 |
| 0.7652777777777778 | 3.525 |
| 0.7659722222222222 | 3.525 |
| 0.7666666666666666 | 3.525 |
| 0.7673611111111112 | 3.525 |
| 0.7680555555555556 | 3.525 |
| 0.7687499999999999 | 0 |
| 0.7694444444444444 | 0 |
| 0.7701388888888889 | 0 |
| 0.7708333333333334 | 0 |
| 0.7715277777777777 | 0 |
| 0.7722222222222223 | 0 |
| 0.7729166666666667 | 0 |
| 0.7736111111111111 | 0 |
| 0.7743055555555555 | 3.525 |
| 0.775 | 3.525 |
| 0.7756944444444445 | 3.525 |
| 0.7763888888888889 | 3.525 |
| 0.7770833333333332 | 3.525 |
| 0.7777777777777778 | 3.525 |
| 0.7784722222222222 | 0 |
| 0.7791666666666667 | 0 |
| 0.779861111111111 | 0 |
| 0.7805555555555556 | 0 |
| 0.78125 | 0 |
| 0.7819444444444444 | 0 |
| 0.782638888888889 | 0 |
| 0.7833333333333333 | 0 |
| 0.7840277777777778 | 0 |
| 0.7847222222222222 | 0 |
| 0.7854166666666668 | 0 |
| 0.7861111111111111 | 0 |
| 0.7868055555555555 | 0 |
| 0.7875 | 0 |
| 0.7881944444444445 | 0 |
| 0.7888888888888889 | 0 |
| 0.7895833333333333 | 0 |
| 0.7902777777777777 | 0 |
| 0.7909722222222223 | 0 |
| 0.7916666666666666 | 0 |
| 0.7923611111111111 | 0 |
| 0.7930555555555556 | 0 |
| 0.7937500000000001 | 0 |
| 0.7944444444444444 | 0 |
| 0.7951388888888888 | 0 |
| 0.7958333333333334 | 0 |
| 0.7965277777777778 | 0 |
| 0.7972222222222222 | 0 |
| 0.7979166666666666 | 0 |
| 0.7986111111111112 | 0 |
| 0.7993055555555556 | 0 |
| 0.7999999999999999 | 0 |
| 0.8006944444444444 | 0 |
| 0.8013888888888889 | 0 |
| 0.8020833333333334 | 0 |
| 0.8027777777777777 | 0 |
| 0.8034722222222223 | 0 |
| 0.8041666666666667 | 0 |
| 0.8048611111111111 | 0 |
| 0.8055555555555555 | 0 |
| 0.80625 | 0 |
| 0.8069444444444445 | 0 |
| 0.8076388888888889 | 0 |
| 0.8083333333333332 | 0 |
| 0.8090277777777778 | 0 |
| 0.8097222222222222 | 0 |
| 0.8104166666666667 | 0 |
| 0.811111111111111 | 0 |
| 0.8118055555555556 | 0 |
| 0.8125 | 0 |
| 0.8131944444444444 | 0 |
| 0.813888888888889 | 0 |
| 0.8145833333333333 | 0 |
| 0.8152777777777778 | 0 |
| 0.8159722222222222 | 0 |
| 0.8166666666666668 | 0 |
| 0.8173611111111111 | 0 |
| 0.8180555555555555 | 0 |
| 0.81875 | 0 |
| 0.8194444444444445 | 0 |
| 0.8201388888888889 | 0 |
| 0.8208333333333333 | 0 |
| 0.8215277777777777 | 0 |
| 0.8222222222222223 | 0 |
| 0.8229166666666666 | 0 |
| 0.8236111111111111 | 0 |
| 0.8243055555555556 | 0 |
| 0.8250000000000001 | 0 |
| 0.8256944444444444 | 0 |
| 0.8263888888888888 | 0 |
| 0.8270833333333334 | 0 |
| 0.8277777777777778 | 0 |
| 0.8284722222222222 | 0 |
| 0.8291666666666666 | 0 |
| 0.8298611111111112 | 0 |
| 0.8305555555555556 | 0 |
| 0.8312499999999999 | 0 |
| 0.8319444444444444 | 0 |
| 0.8326388888888889 | 0 |
| 0.8333333333333334 | 0 |
| 0.8340277777777777 | 0 |
| 0.8347222222222223 | 0 |
| 0.8354166666666667 | 0 |
| 0.8361111111111111 | 0 |
| 0.8368055555555555 | 0 |
| 0.8375 | 0 |
| 0.8381944444444445 | 0 |
| 0.8388888888888889 | 0 |
| 0.8395833333333332 | 0 |
| 0.8402777777777778 | 0 |
| 0.8409722222222222 | 0 |
| 0.8416666666666667 | 0 |
| 0.842361111111111 | 0 |
| 0.8430555555555556 | 0 |
| 0.84375 | 0 |
| 0.8444444444444444 | 0 |
| 0.845138888888889 | 0 |
| 0.8458333333333333 | 0 |
| 0.8465277777777778 | 0 |
| 0.8472222222222222 | 0 |
| 0.8479166666666668 | 0 |
| 0.8486111111111111 | 0 |
| 0.8493055555555555 | 0 |
| 0.85 | 0 |
| 0.8506944444444445 | 0 |
| 0.8513888888888889 | 0 |
| 0.8520833333333333 | 0 |
| 0.8527777777777777 | 0 |
| 0.8534722222222223 | 0 |
| 0.8541666666666666 | 0 |
| 0.8548611111111111 | 0 |
| 0.8555555555555556 | 0 |
| 0.8562500000000001 | 0 |
| 0.8569444444444444 | 0 |
| 0.8576388888888888 | 0 |
| 0.8583333333333334 | 0 |
| 0.8590277777777778 | 0 |
| 0.8597222222222222 | 0 |
| 0.8604166666666666 | 0 |
| 0.8611111111111112 | 0 |
| 0.8618055555555556 | 0 |
| 0.8624999999999999 | 0 |
| 0.8631944444444444 | 0 |
| 0.8638888888888889 | 0 |
| 0.8645833333333334 | 0 |
| 0.8652777777777777 | 0 |
| 0.8659722222222223 | 0 |
| 0.8666666666666667 | 0 |
| 0.8673611111111111 | 0 |
| 0.8680555555555555 | 0 |
| 0.86875 | 0 |
| 0.8694444444444445 | 0 |
| 0.8701388888888889 | 0 |
| 0.8708333333333332 | 0 |
| 0.8715277777777778 | 0 |
| 0.8722222222222222 | 0 |
| 0.8729166666666667 | 0 |
| 0.873611111111111 | 0 |
| 0.8743055555555556 | 0 |
| 0.875 | 0 |
| 0.8756944444444444 | 0 |
| 0.876388888888889 | 0 |
| 0.8770833333333333 | 0 |
| 0.8777777777777778 | 0 |
| 0.8784722222222222 | 0 |
| 0.8791666666666668 | 0 |
| 0.8798611111111111 | 0 |
| 0.8805555555555555 | 0 |
| 0.88125 | 0 |
| 0.8819444444444445 | 0 |
| 0.8826388888888889 | 0 |
| 0.8833333333333333 | 0 |
| 0.8840277777777777 | 0 |
| 0.8847222222222223 | 0 |
| 0.8854166666666666 | 0 |
| 0.8861111111111111 | 0 |
| 0.8868055555555556 | 0 |
| 0.8875000000000001 | 0 |
| 0.8881944444444444 | 0 |
| 0.8888888888888888 | 0 |
| 0.8895833333333334 | 0 |
| 0.8902777777777778 | 0 |
| 0.8909722222222222 | 0 |
| 0.8916666666666666 | 0 |
| 0.8923611111111112 | 0 |
| 0.8930555555555556 | 0 |
| 0.8937499999999999 | 0 |
| 0.8944444444444444 | 0 |
| 0.8951388888888889 | 0 |
| 0.8958333333333334 | 0 |
| 0.8965277777777777 | 0 |
| 0.8972222222222223 | 0 |
| 0.8979166666666667 | 0 |
| 0.8986111111111111 | 0 |
| 0.8993055555555555 | 0 |
| 0.9 | 0 |
| 0.9006944444444445 | 0 |
| 0.9013888888888889 | 0 |
| 0.9020833333333332 | 0 |
| 0.9027777777777778 | 0 |
| 0.9034722222222222 | 0 |
| 0.9041666666666667 | 0 |
| 0.904861111111111 | 0 |
| 0.9055555555555556 | 0 |
| 0.90625 | 0 |
| 0.9069444444444444 | 0 |
| 0.907638888888889 | 0 |
| 0.9083333333333333 | 0 |
| 0.9090277777777778 | 0 |
| 0.9097222222222222 | 0 |
| 0.9104166666666668 | 0 |
| 0.9111111111111111 | 0 |
| 0.9118055555555555 | 0 |
| 0.9125 | 0 |
| 0.9131944444444445 | 0 |
| 0.9138888888888889 | 0 |
| 0.9145833333333333 | 0 |
| 0.9152777777777777 | 0 |
| 0.9159722222222223 | 0 |
| 0.9166666666666666 | 0 |
| 0.9173611111111111 | 0 |
| 0.9180555555555556 | 0 |
| 0.9187500000000001 | 0 |
| 0.9194444444444444 | 0 |
| 0.9201388888888888 | 0 |
| 0.9208333333333334 | 0 |
| 0.9215277777777778 | 0 |
| 0.9222222222222222 | 0 |
| 0.9229166666666666 | 0 |
| 0.9236111111111112 | 0 |
| 0.9243055555555556 | 0 |
| 0.9249999999999999 | 0 |
| 0.9256944444444444 | 0 |
| 0.9263888888888889 | 0 |
| 0.9270833333333334 | 0 |
| 0.9277777777777777 | 0 |
| 0.9284722222222223 | 0 |
| 0.9291666666666667 | 0 |
| 0.9298611111111111 | 0 |
| 0.9305555555555555 | 0 |
| 0.93125 | 0 |
| 0.9319444444444445 | 0 |
| 0.9326388888888889 | 0 |
| 0.9333333333333332 | 0 |
| 0.9340277777777778 | 0 |
| 0.9347222222222222 | 0 |
| 0.9354166666666667 | 0 |
| 0.936111111111111 | 0 |
| 0.9368055555555556 | 0 |
| 0.9375 | 0 |
| 0.9381944444444444 | 0 |
| 0.938888888888889 | 0 |
| 0.9395833333333333 | 0 |
| 0.9402777777777778 | 0 |
| 0.9409722222222222 | 0 |
| 0.9416666666666668 | 0 |
| 0.9423611111111111 | 0 |
| 0.9430555555555555 | 0 |
| 0.94375 | 0 |
| 0.9444444444444445 | 0 |
| 0.9451388888888889 | 0 |
| 0.9458333333333333 | 0 |
| 0.9465277777777777 | 0 |
| 0.9472222222222223 | 0 |
| 0.9479166666666666 | 0 |
| 0.9486111111111111 | 0 |
| 0.9493055555555556 | 0 |
| 0.9500000000000001 | 0 |
| 0.9506944444444444 | 0 |
| 0.9513888888888888 | 0 |
| 0.9520833333333334 | 0 |
| 0.9527777777777778 | 0 |
| 0.9534722222222222 | 0 |
| 0.9541666666666666 | 0 |
| 0.9548611111111112 | 0 |
| 0.9555555555555556 | 0 |
| 0.9562499999999999 | 0 |
| 0.9569444444444444 | 0 |
| 0.9576388888888889 | 0 |
| 0.9583333333333334 | 0 |
| 0.9590277777777777 | 0 |
| 0.9597222222222223 | 0 |
| 0.9604166666666667 | 0 |
| 0.9611111111111111 | 0 |
| 0.9618055555555555 | 0 |
| 0.9625 | 0 |
| 0.9631944444444445 | 0 |
| 0.9638888888888889 | 0 |
| 0.9645833333333332 | 0 |
| 0.9652777777777778 | 0 |
| 0.9659722222222222 | 0 |
| 0.9666666666666667 | 0 |
| 0.967361111111111 | 0 |
| 0.9680555555555556 | 0 |
| 0.96875 | 0 |
| 0.9694444444444444 | 0 |
| 0.970138888888889 | 0 |
| 0.9708333333333333 | 0 |
| 0.9715277777777778 | 0 |
| 0.9722222222222222 | 0 |
| 0.9729166666666668 | 0 |
| 0.9736111111111111 | 0 |
| 0.9743055555555555 | 0 |
| 0.975 | 0 |
| 0.9756944444444445 | 0 |
| 0.9763888888888889 | 0 |
| 0.9770833333333333 | 0 |
| 0.9777777777777777 | 0 |
| 0.9784722222222223 | 0 |
| 0.9791666666666666 | 0 |
| 0.9798611111111111 | 0 |
| 0.9805555555555556 | 0 |
| 0.9812500000000001 | 0 |
| 0.9819444444444444 | 0 |
| 0.9826388888888888 | 0 |
| 0.9833333333333334 | 0 |
| 0.9840277777777778 | 0 |
| 0.9847222222222222 | 0 |
| 0.9854166666666666 | 0 |
| 0.9861111111111112 | 0 |
| 0.9868055555555556 | 0 |
| 0.9874999999999999 | 0 |
| 0.9881944444444444 | 0 |
| 0.9888888888888889 | 0 |
| 0.9895833333333334 | 0 |
| 0.9902777777777777 | 0 |
| 0.9909722222222223 | 0 |
| 0.9916666666666667 | 0 |
| 0.9923611111111111 | 0 |
| 0.9930555555555555 | 0 |
| 0.99375 | 0 |
| 0.9944444444444445 | 0 |
| 0.9951388888888889 | 0 |
| 0.9958333333333332 | 0 |
| 0.9965277777777778 | 0 |
| 0.9972222222222222 | 0 |
| 0.9979166666666667 | 0 |
| 0.998611111111111 | 0 |
| 0.9993055555555556 | 0 |